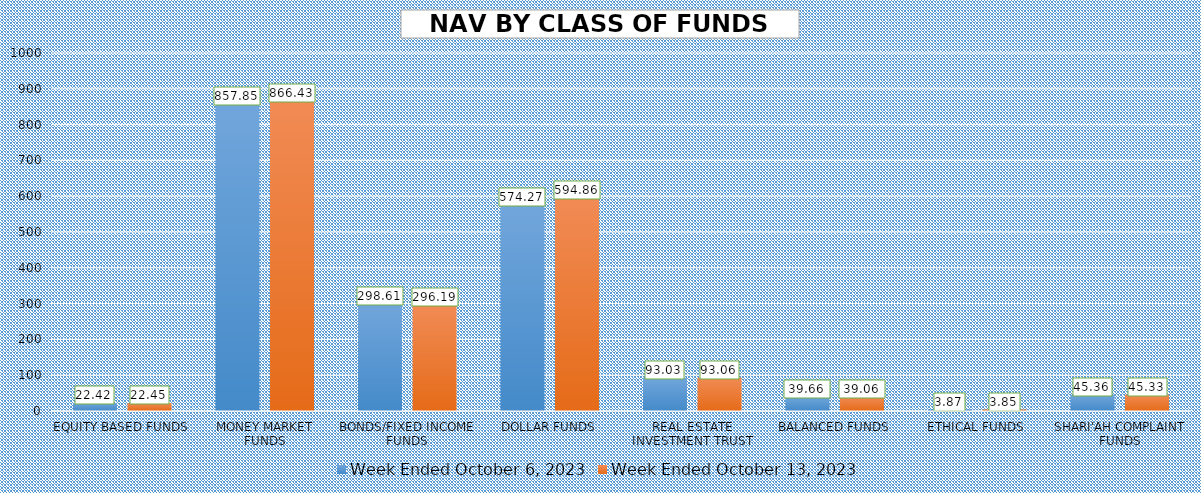
| Category | Week Ended October 6, 2023 | Week Ended October 13, 2023 |
|---|---|---|
| EQUITY BASED FUNDS | 22.42 | 22.453 |
| MONEY MARKET FUNDS | 857.851 | 866.43 |
| BONDS/FIXED INCOME FUNDS | 298.612 | 296.194 |
| DOLLAR FUNDS | 574.272 | 594.856 |
| REAL ESTATE INVESTMENT TRUST | 93.026 | 93.064 |
| BALANCED FUNDS | 39.656 | 39.056 |
| ETHICAL FUNDS | 3.872 | 3.848 |
| SHARI'AH COMPLAINT FUNDS | 45.359 | 45.329 |